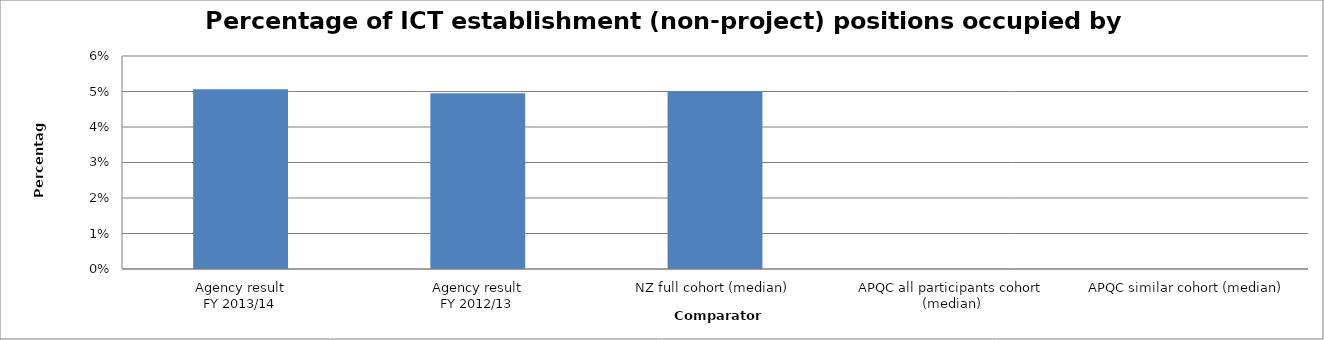
| Category | Result |
|---|---|
| Agency result
FY 2013/14 | 0.051 |
| Agency result
FY 2012/13 | 0.05 |
| NZ full cohort (median) | 0.05 |
| APQC all participants cohort (median) | 0 |
| APQC similar cohort (median) | 0 |